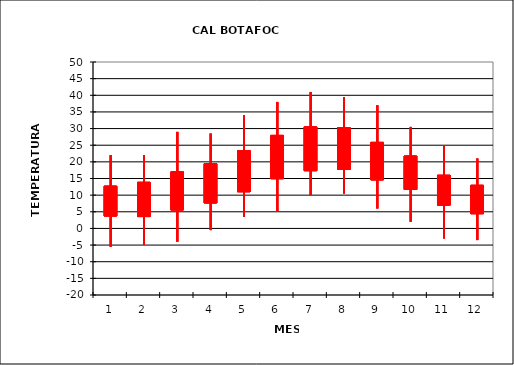
| Category | Series 0 | Series 1 | Series 2 | Series 3 |
|---|---|---|---|---|
| 0 | 12.696 | 22 | -5.5 | 3.723 |
| 1 | 13.85 | 22 | -5 | 3.562 |
| 2 | 16.996 | 29 | -4 | 5.538 |
| 3 | 19.419 | 28.5 | -0.5 | 7.658 |
| 4 | 23.385 | 34 | 3.5 | 11.023 |
| 5 | 27.95 | 38 | 5 | 14.942 |
| 6 | 30.496 | 41 | 10 | 17.346 |
| 7 | 30.288 | 39.5 | 10.5 | 17.704 |
| 8 | 25.85 | 37 | 6 | 14.588 |
| 9 | 21.742 | 30.5 | 2 | 11.704 |
| 10 | 15.969 | 25 | -3 | 6.977 |
| 11 | 12.954 | 21 | -3.5 | 4.423 |